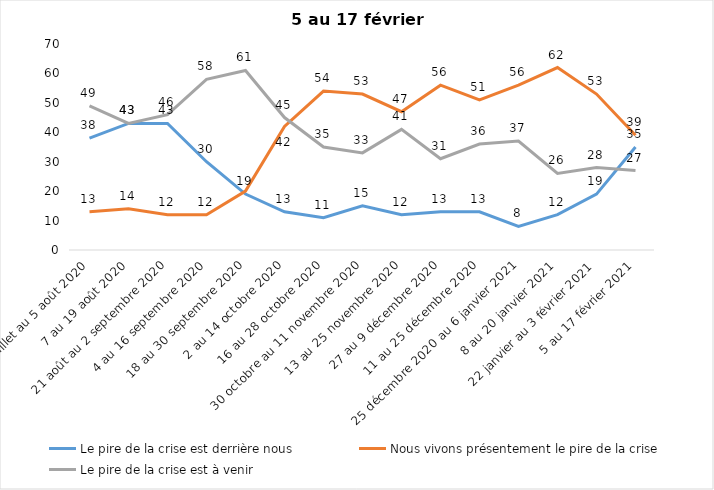
| Category | Le pire de la crise est derrière nous | Nous vivons présentement le pire de la crise | Le pire de la crise est à venir |
|---|---|---|---|
| 24 juillet au 5 août 2020 | 38 | 13 | 49 |
| 7 au 19 août 2020 | 43 | 14 | 43 |
| 21 août au 2 septembre 2020 | 43 | 12 | 46 |
| 4 au 16 septembre 2020 | 30 | 12 | 58 |
| 18 au 30 septembre 2020 | 19 | 20 | 61 |
| 2 au 14 octobre 2020 | 13 | 42 | 45 |
| 16 au 28 octobre 2020 | 11 | 54 | 35 |
| 30 octobre au 11 novembre 2020 | 15 | 53 | 33 |
| 13 au 25 novembre 2020 | 12 | 47 | 41 |
| 27 au 9 décembre 2020 | 13 | 56 | 31 |
| 11 au 25 décembre 2020 | 13 | 51 | 36 |
| 25 décembre 2020 au 6 janvier 2021 | 8 | 56 | 37 |
| 8 au 20 janvier 2021 | 12 | 62 | 26 |
| 22 janvier au 3 février 2021 | 19 | 53 | 28 |
| 5 au 17 février 2021 | 35 | 39 | 27 |